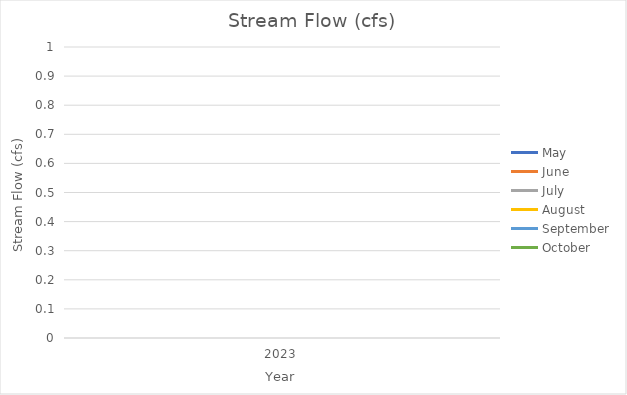
| Category | May | June | July | August | September | October |
|---|---|---|---|---|---|---|
| 2023.0 | 0 | 0 | 0 | 0 | 0 | 0 |